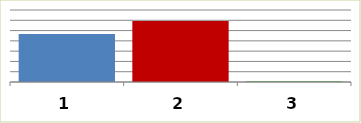
| Category | Series 0 |
|---|---|
| 0 | 2335691476.38 |
| 1 | 2960929600.17 |
| 2 | 21157611.45 |